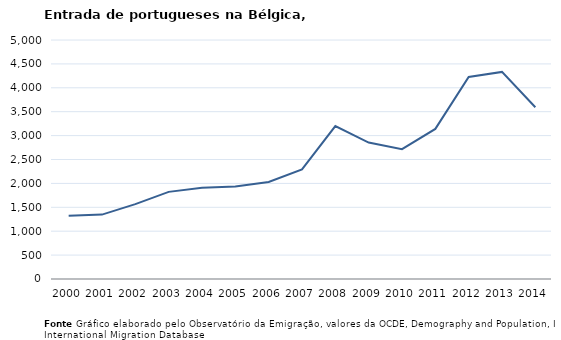
| Category | Entradas |
|---|---|
| 2000.0 | 1324 |
| 2001.0 | 1347 |
| 2002.0 | 1567 |
| 2003.0 | 1823 |
| 2004.0 | 1907 |
| 2005.0 | 1934 |
| 2006.0 | 2030 |
| 2007.0 | 2293 |
| 2008.0 | 3200 |
| 2009.0 | 2854 |
| 2010.0 | 2717 |
| 2011.0 | 3140 |
| 2012.0 | 4228 |
| 2013.0 | 4332 |
| 2014.0 | 3594 |